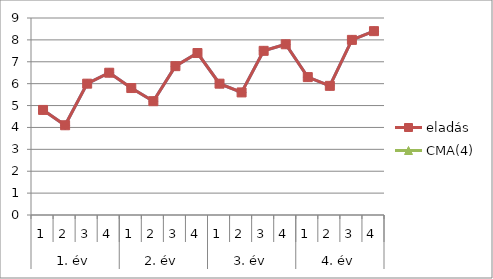
| Category | Series 0 | eladás | CMA(4) |
|---|---|---|---|
| 0 | 4.8 | 4.8 |  |
| 1 | 4.1 | 4.1 |  |
| 2 | 6 | 6 |  |
| 3 | 6.5 | 6.5 |  |
| 4 | 5.8 | 5.8 |  |
| 5 | 5.2 | 5.2 |  |
| 6 | 6.8 | 6.8 |  |
| 7 | 7.4 | 7.4 |  |
| 8 | 6 | 6 |  |
| 9 | 5.6 | 5.6 |  |
| 10 | 7.5 | 7.5 |  |
| 11 | 7.8 | 7.8 |  |
| 12 | 6.3 | 6.3 |  |
| 13 | 5.9 | 5.9 |  |
| 14 | 8 | 8 |  |
| 15 | 8.4 | 8.4 |  |